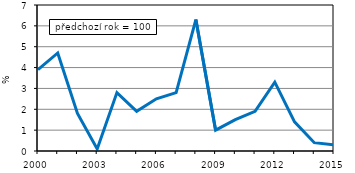
| Category | Series 0 |
|---|---|
| 2000.0 | 3.9 |
| 2001.0 | 4.7 |
| 2002.0 | 1.8 |
| 2003.0 | 0.1 |
| 2004.0 | 2.8 |
| 2005.0 | 1.9 |
| 2006.0 | 2.5 |
| 2007.0 | 2.8 |
| 2008.0 | 6.3 |
| 2009.0 | 1 |
| 2010.0 | 1.5 |
| 2011.0 | 1.9 |
| 2012.0 | 3.3 |
| 2013.0 | 1.4 |
| 2014.0 | 0.4 |
| 2015.0 | 0.3 |